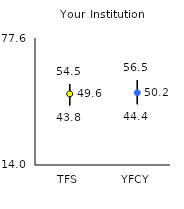
| Category | 25th | 75th | Mean |
|---|---|---|---|
| TFS | 43.8 | 54.5 | 49.63 |
| YFCY | 44.4 | 56.5 | 50.21 |